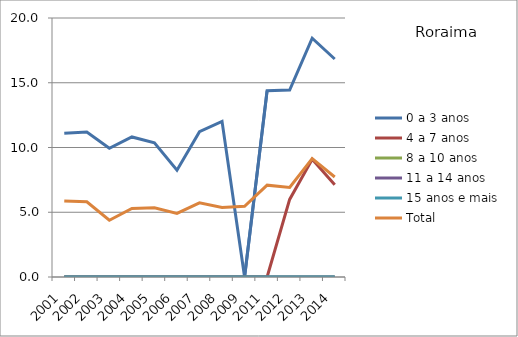
| Category | 0 a 3 anos | 4 a 7 anos | 8 a 10 anos | 11 a 14 anos | 15 anos e mais | Total |
|---|---|---|---|---|---|---|
| 2001.0 | 11.099 | 0 | 0 | 0 | 0 | 5.874 |
| 2002.0 | 11.193 | 0 | 0 | 0 | 0 | 5.808 |
| 2003.0 | 9.944 | 0 | 0 | 0 | 0 | 4.382 |
| 2004.0 | 10.816 | 0 | 0 | 0 | 0 | 5.289 |
| 2005.0 | 10.363 | 0 | 0 | 0 | 0 | 5.352 |
| 2006.0 | 8.251 | 0 | 0 | 0 | 0 | 4.909 |
| 2007.0 | 11.221 | 0 | 0 | 0 | 0 | 5.724 |
| 2008.0 | 12.015 | 0 | 0 | 0 | 0 | 5.362 |
| 2009.0 | 0 | 0 | 0 | 0 | 0 | 5.465 |
| 2011.0 | 14.387 | 0 | 0 | 0 | 0 | 7.091 |
| 2012.0 | 14.438 | 5.993 | 0 | 0 | 0 | 6.915 |
| 2013.0 | 18.436 | 9.093 | 0 | 0 | 0 | 9.138 |
| 2014.0 | 16.834 | 7.13 | 0 | 0 | 0 | 7.721 |